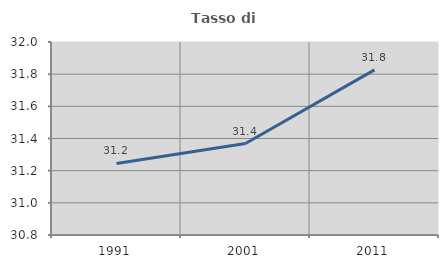
| Category | Tasso di occupazione   |
|---|---|
| 1991.0 | 31.245 |
| 2001.0 | 31.369 |
| 2011.0 | 31.827 |